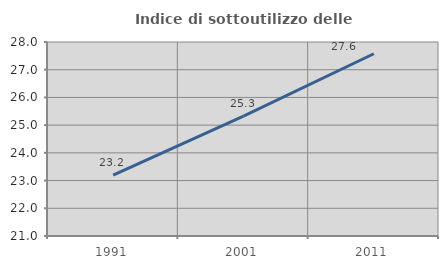
| Category | Indice di sottoutilizzo delle abitazioni  |
|---|---|
| 1991.0 | 23.194 |
| 2001.0 | 25.327 |
| 2011.0 | 27.576 |